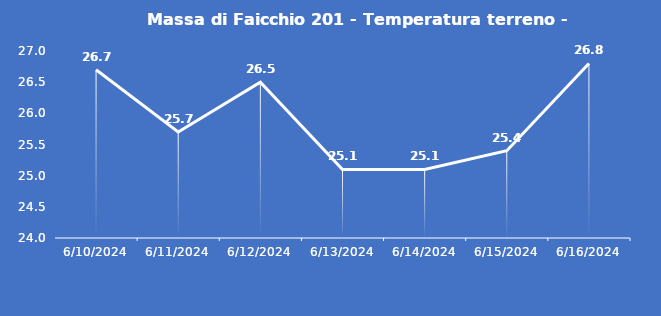
| Category | Massa di Faicchio 201 - Temperatura terreno - Grezzo (°C) |
|---|---|
| 6/10/24 | 26.7 |
| 6/11/24 | 25.7 |
| 6/12/24 | 26.5 |
| 6/13/24 | 25.1 |
| 6/14/24 | 25.1 |
| 6/15/24 | 25.4 |
| 6/16/24 | 26.8 |